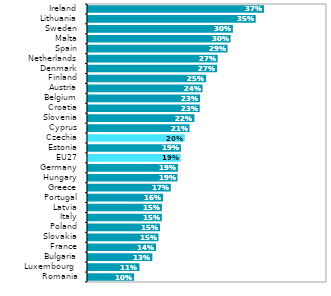
| Category | Series 1 |
|---|---|
| Romania | 0.097 |
| Luxembourg  | 0.108 |
| Bulgaria | 0.135 |
| France | 0.142 |
| Slovakia | 0.148 |
| Poland | 0.151 |
| Italy | 0.155 |
| Latvia | 0.155 |
| Portugal | 0.157 |
| Greece | 0.173 |
| Hungary | 0.187 |
| Germany | 0.188 |
| EU27 | 0.194 |
| Estonia | 0.194 |
| Czechia | 0.202 |
| Cyprus | 0.212 |
| Slovenia | 0.223 |
| Croatia | 0.234 |
| Belgium | 0.234 |
| Austria | 0.24 |
| Finland | 0.247 |
| Denmark | 0.27 |
| Netherlands | 0.271 |
| Spain | 0.292 |
| Malta | 0.298 |
| Sweden | 0.303 |
| Lithuania | 0.351 |
| Ireland | 0.368 |